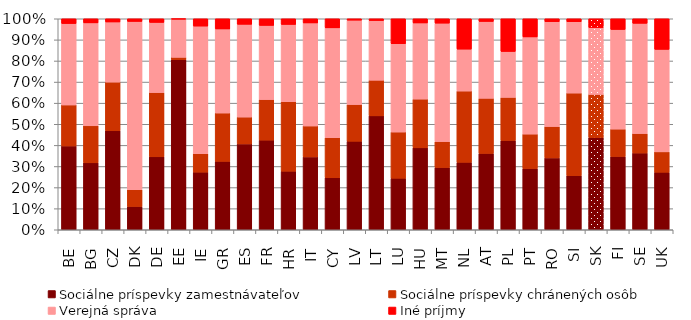
| Category | Sociálne príspevky zamestnávateľov | Sociálne príspevky chránených osôb | Verejná správa | Iné príjmy |
|---|---|---|---|---|
| BE | 39.71 | 19.46 | 38.57 | 2.26 |
| BG | 31.73 | 17.54 | 48.78 | 1.94 |
| CZ | 46.91 | 23.08 | 28.5 | 1.52 |
| DK | 11.02 | 7.94 | 79.77 | 1.27 |
| DE | 34.57 | 30.45 | 33.25 | 1.73 |
| EE | 80.63 | 1.1 | 18.13 | 0.15 |
| IE | 27.3 | 8.75 | 60.47 | 3.47 |
| GR | 32.41 | 22.93 | 39.83 | 4.83 |
| ES | 40.69 | 12.72 | 43.97 | 2.62 |
| FR | 42.49 | 19.23 | 35.13 | 3.15 |
| HR | 27.77 | 32.93 | 36.61 | 2.69 |
| IT | 34.54 | 14.67 | 48.82 | 1.98 |
| CY | 24.63 | 19.02 | 52.04 | 4.3 |
| LV | 41.94 | 17.42 | 39.98 | 0.66 |
| LT | 53.98 | 16.88 | 28.29 | 0.84 |
| LU | 24.41 | 21.91 | 41.85 | 11.82 |
| HU | 38.84 | 23.07 | 36.1 | 1.99 |
| MT | 29.49 | 12.29 | 56.14 | 2.08 |
| NL | 31.95 | 33.79 | 19.86 | 14.39 |
| AT | 36.18 | 26.12 | 36.42 | 1.28 |
| PL | 42.34 | 20.42 | 21.76 | 15.51 |
| PT | 29.01 | 16.32 | 46.06 | 8.61 |
| RO | 34.05 | 14.88 | 49.67 | 1.39 |
| SI | 25.65 | 39.13 | 33.82 | 1.4 |
| SK | 43.67 | 20.48 | 31.66 | 4.19 |
| FI | 34.72 | 12.97 | 47.23 | 5.08 |
| SE | 36.37 | 9.24 | 52.24 | 2.15 |
| UK | 27.25 | 9.66 | 48.59 | 14.5 |